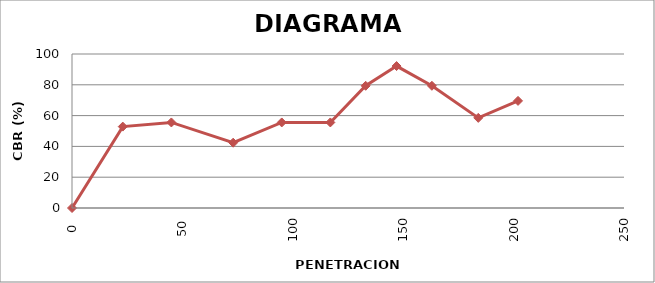
| Category | DIAGRAMA ESTRUCTURAL |
|---|---|
| 0.0 | 0 |
| 23.0 | 52.856 |
| 45.0 | 55.554 |
| 73.0 | 42.405 |
| 95.0 | 55.554 |
| 117.0 | 55.554 |
| 133.0 | 79.362 |
| 147.0 | 92.165 |
| 163.0 | 79.362 |
| 184.0 | 58.525 |
| 202.0 | 69.554 |